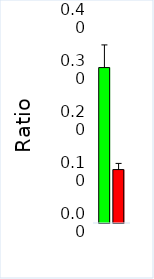
| Category | Control | ASD |
|---|---|---|
| CK:
Cas7 | 0.305 | 0.105 |